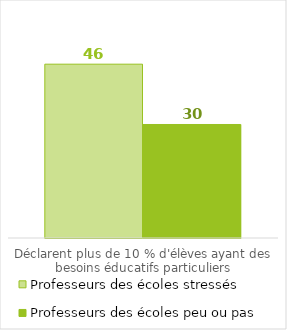
| Category | Professeurs des écoles stressés | Professeurs des écoles peu ou pas stressés |
|---|---|---|
| Déclarent plus de 10 % d'élèves ayant des besoins éducatifs particuliers | 46.352 | 30.27 |